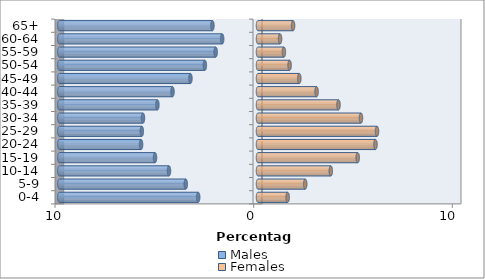
| Category | Males | Females |
|---|---|---|
| 0-4 | -3.011 | 1.493 |
| 5-9 | -3.636 | 2.377 |
| 10-14 | -4.48 | 3.664 |
| 15-19 | -5.183 | 5.019 |
| 20-24 | -5.885 | 5.914 |
| 25-29 | -5.848 | 5.991 |
| 30-34 | -5.79 | 5.182 |
| 35-39 | -5.065 | 4.052 |
| 40-44 | -4.304 | 2.949 |
| 45-49 | -3.401 | 2.08 |
| 50-54 | -2.675 | 1.591 |
| 55-59 | -2.13 | 1.303 |
| 60-64 | -1.804 | 1.111 |
| 65+ | -2.294 | 1.766 |